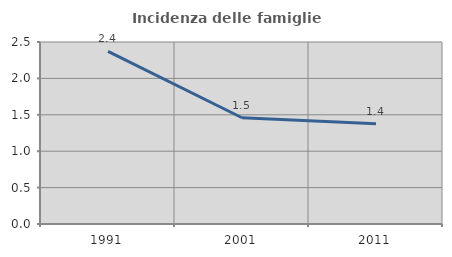
| Category | Incidenza delle famiglie numerose |
|---|---|
| 1991.0 | 2.372 |
| 2001.0 | 1.46 |
| 2011.0 | 1.377 |